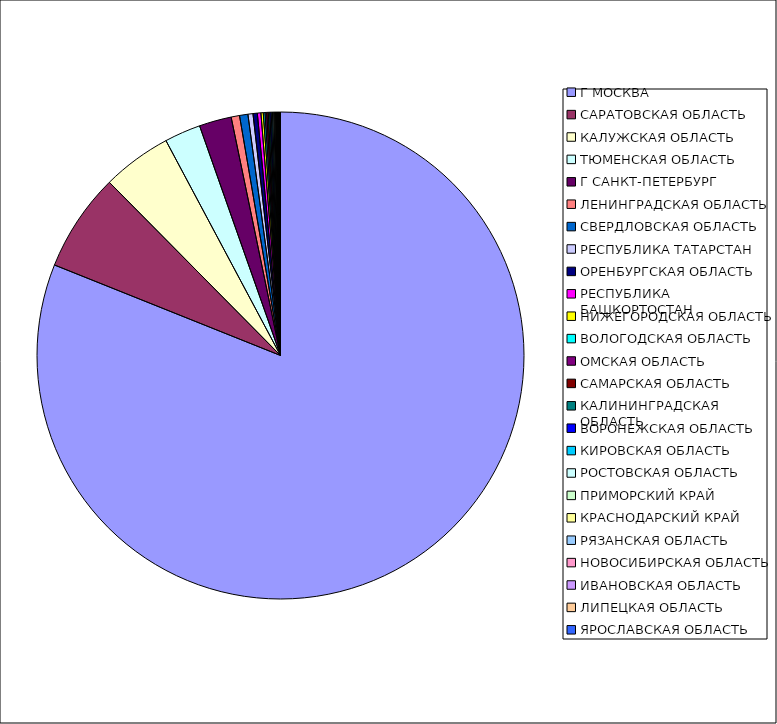
| Category | Оборот |
|---|---|
| Г МОСКВА | 0.81 |
| САРАТОВСКАЯ ОБЛАСТЬ | 0.065 |
| КАЛУЖСКАЯ ОБЛАСТЬ | 0.046 |
| ТЮМЕНСКАЯ ОБЛАСТЬ | 0.024 |
| Г САНКТ-ПЕТЕРБУРГ | 0.021 |
| ЛЕНИНГРАДСКАЯ ОБЛАСТЬ | 0.006 |
| СВЕРДЛОВСКАЯ ОБЛАСТЬ | 0.006 |
| РЕСПУБЛИКА ТАТАРСТАН | 0.003 |
| ОРЕНБУРГСКАЯ ОБЛАСТЬ | 0.003 |
| РЕСПУБЛИКА БАШКОРТОСТАН | 0.002 |
| НИЖЕГОРОДСКАЯ ОБЛАСТЬ | 0.002 |
| ВОЛОГОДСКАЯ ОБЛАСТЬ | 0.001 |
| ОМСКАЯ ОБЛАСТЬ | 0.001 |
| САМАРСКАЯ ОБЛАСТЬ | 0.001 |
| КАЛИНИНГРАДСКАЯ ОБЛАСТЬ | 0.001 |
| ВОРОНЕЖСКАЯ ОБЛАСТЬ | 0.001 |
| КИРОВСКАЯ ОБЛАСТЬ | 0.001 |
| РОСТОВСКАЯ ОБЛАСТЬ | 0.001 |
| ПРИМОРСКИЙ КРАЙ | 0.001 |
| КРАСНОДАРСКИЙ КРАЙ | 0.001 |
| РЯЗАНСКАЯ ОБЛАСТЬ | 0 |
| НОВОСИБИРСКАЯ ОБЛАСТЬ | 0 |
| ИВАНОВСКАЯ ОБЛАСТЬ | 0 |
| ЛИПЕЦКАЯ ОБЛАСТЬ | 0 |
| ЯРОСЛАВСКАЯ ОБЛАСТЬ | 0 |
| ПСКОВСКАЯ ОБЛАСТЬ | 0 |
| ТВЕРСКАЯ ОБЛАСТЬ | 0 |
| ИРКУТСКАЯ ОБЛАСТЬ | 0 |
| ТУЛЬСКАЯ ОБЛАСТЬ | 0 |
| СТАВРОПОЛЬСКИЙ КРАЙ | 0 |
| КРАСНОЯРСКИЙ КРАЙ | 0 |
| МОСКОВСКАЯ ОБЛАСТЬ | 0 |
| АЛТАЙСКИЙ КРАЙ | 0 |
| РЕСПУБЛИКА ХАКАСИЯ | 0 |
| ВОЛГОГРАДСКАЯ ОБЛАСТЬ | 0 |